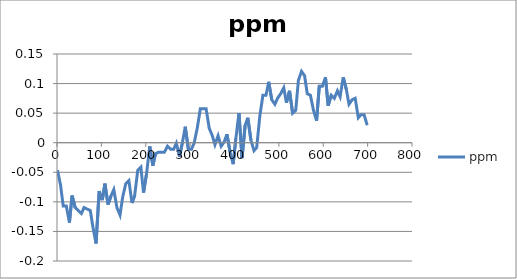
| Category | ppm |
|---|---|
| 1.0 | -0.046 |
| 8.0 | -0.072 |
| 14.0 | -0.107 |
| 21.0 | -0.107 |
| 28.0 | -0.135 |
| 34.0 | -0.089 |
| 41.0 | -0.11 |
| 48.0 | -0.115 |
| 55.0 | -0.12 |
| 61.0 | -0.11 |
| 68.0 | -0.112 |
| 75.0 | -0.115 |
| 81.0 | -0.143 |
| 88.0 | -0.17 |
| 95.0 | -0.082 |
| 102.0 | -0.097 |
| 108.0 | -0.069 |
| 115.0 | -0.105 |
| 122.0 | -0.089 |
| 128.0 | -0.079 |
| 135.0 | -0.11 |
| 142.0 | -0.122 |
| 148.0 | -0.092 |
| 155.0 | -0.069 |
| 162.0 | -0.064 |
| 169.0 | -0.102 |
| 175.0 | -0.089 |
| 182.0 | -0.046 |
| 189.0 | -0.041 |
| 195.0 | -0.084 |
| 202.0 | -0.051 |
| 209.0 | -0.006 |
| 216.0 | -0.039 |
| 222.0 | -0.019 |
| 229.0 | -0.016 |
| 236.0 | -0.016 |
| 242.0 | -0.016 |
| 249.0 | -0.006 |
| 256.0 | -0.011 |
| 263.0 | -0.011 |
| 269.0 | -0.001 |
| 276.0 | -0.024 |
| 283.0 | 0.002 |
| 289.0 | 0.027 |
| 296.0 | -0.011 |
| 303.0 | -0.011 |
| 309.0 | -0.001 |
| 316.0 | 0.024 |
| 323.0 | 0.057 |
| 330.0 | 0.057 |
| 336.0 | 0.057 |
| 343.0 | 0.024 |
| 350.0 | 0.012 |
| 356.0 | -0.003 |
| 363.0 | 0.012 |
| 370.0 | -0.006 |
| 377.0 | 0.002 |
| 383.0 | 0.014 |
| 390.0 | -0.016 |
| 397.0 | -0.036 |
| 403.0 | 0.007 |
| 410.0 | 0.05 |
| 417.0 | -0.026 |
| 424.0 | 0.03 |
| 430.0 | 0.042 |
| 437.0 | 0.004 |
| 444.0 | -0.013 |
| 450.0 | -0.008 |
| 457.0 | 0.045 |
| 464.0 | 0.08 |
| 471.0 | 0.08 |
| 477.0 | 0.103 |
| 484.0 | 0.073 |
| 491.0 | 0.065 |
| 497.0 | 0.075 |
| 504.0 | 0.083 |
| 511.0 | 0.093 |
| 517.0 | 0.068 |
| 524.0 | 0.088 |
| 531.0 | 0.05 |
| 538.0 | 0.055 |
| 544.0 | 0.106 |
| 551.0 | 0.121 |
| 558.0 | 0.113 |
| 564.0 | 0.083 |
| 571.0 | 0.08 |
| 578.0 | 0.055 |
| 585.0 | 0.037 |
| 591.0 | 0.095 |
| 598.0 | 0.095 |
| 605.0 | 0.111 |
| 611.0 | 0.063 |
| 618.0 | 0.08 |
| 625.0 | 0.075 |
| 632.0 | 0.088 |
| 638.0 | 0.078 |
| 645.0 | 0.111 |
| 652.0 | 0.09 |
| 658.0 | 0.065 |
| 665.0 | 0.073 |
| 672.0 | 0.075 |
| 679.0 | 0.042 |
| 685.0 | 0.047 |
| 692.0 | 0.047 |
| 699.0 | 0.03 |